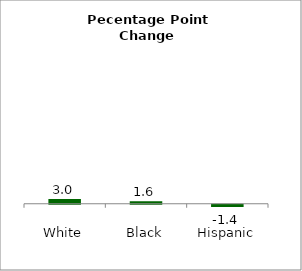
| Category | Series 0 |
|---|---|
| White | 2.966 |
| Black | 1.579 |
| Hispanic | -1.41 |